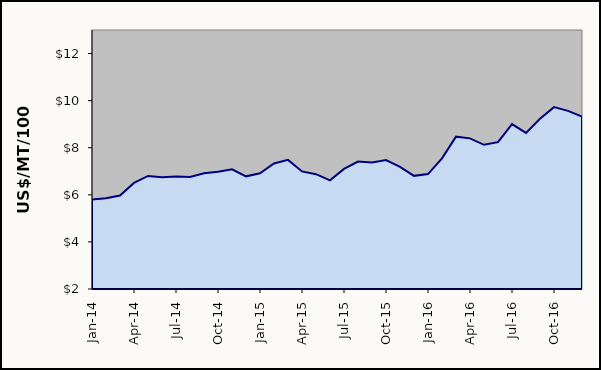
| Category | Series 0 |
|---|---|
| 2014-01-01 | 5.801 |
| 2014-02-01 | 5.854 |
| 2014-03-01 | 5.971 |
| 2014-04-01 | 6.506 |
| 2014-05-01 | 6.8 |
| 2014-06-01 | 6.742 |
| 2014-07-01 | 6.774 |
| 2014-08-01 | 6.753 |
| 2014-09-01 | 6.919 |
| 2014-10-01 | 6.978 |
| 2014-11-01 | 7.086 |
| 2014-12-01 | 6.784 |
| 2015-01-01 | 6.914 |
| 2015-02-01 | 7.331 |
| 2015-03-01 | 7.485 |
| 2015-04-01 | 6.995 |
| 2015-05-01 | 6.878 |
| 2015-06-01 | 6.617 |
| 2015-07-01 | 7.101 |
| 2015-08-01 | 7.413 |
| 2015-09-01 | 7.369 |
| 2015-10-01 | 7.476 |
| 2015-11-01 | 7.189 |
| 2015-12-01 | 6.806 |
| 2016-01-01 | 6.88 |
| 2016-02-01 | 7.55 |
| 2016-03-01 | 8.47 |
| 2016-04-01 | 8.398 |
| 2016-05-01 | 8.125 |
| 2016-06-01 | 8.237 |
| 2016-07-01 | 9.003 |
| 2016-08-01 | 8.629 |
| 2016-09-01 | 9.227 |
| 2016-10-01 | 9.723 |
| 2016-11-01 | 9.564 |
| 2016-12-01 | 9.323 |